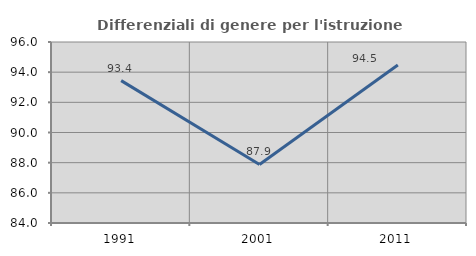
| Category | Differenziali di genere per l'istruzione superiore |
|---|---|
| 1991.0 | 93.44 |
| 2001.0 | 87.88 |
| 2011.0 | 94.472 |